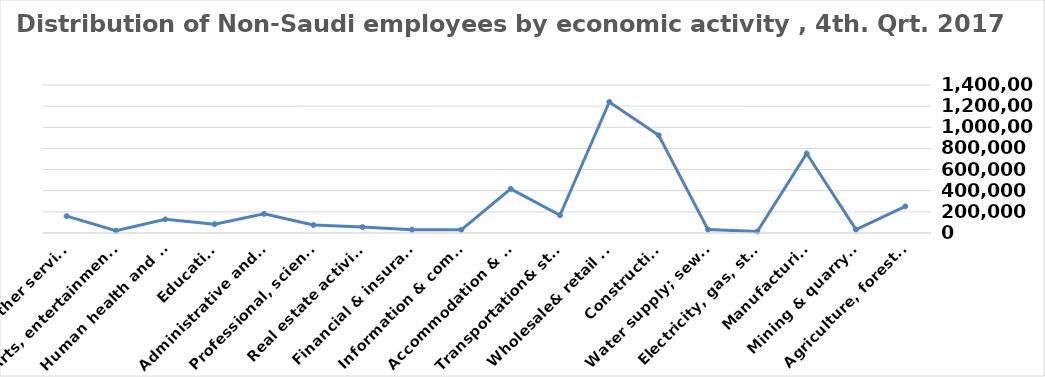
| Category | Series 0 |
|---|---|
| Agriculture, forestry & fishing | 251645 |
| Mining & quarrying | 32493 |
| Manufacturing | 751550 |
| Electricity, gas, steam & air conditioning supply | 14599 |
| Water supply; sewerage, waste remediation  | 32387 |
| Construction | 924855 |
| Wholesale& retail trade; repair of motor vehicles | 1240167 |
| Transportation& storage | 167896 |
| Accommodation & food service activities | 417012 |
| Information & communication | 30103 |
| Financial & insurance | 31263 |
| Real estate activities | 55704 |
| Professional, scientific & technical activities | 75127 |
| Administrative and support service activities | 180909 |
| Education | 83524 |
| Human health and &l work activities | 128899 |
| Arts, entertainment & recreation | 22197 |
| Other service | 159425 |